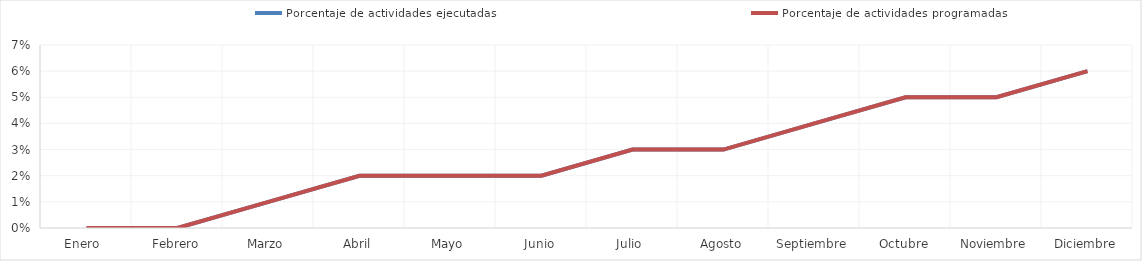
| Category | Porcentaje de actividades ejecutadas  | Porcentaje de actividades programadas |
|---|---|---|
| Enero  | 0 | 0 |
| Febrero | 0 | 0 |
| Marzo | 0.01 | 0.01 |
| Abril | 0.02 | 0.02 |
| Mayo | 0.02 | 0.02 |
| Junio | 0.02 | 0.02 |
| Julio | 0.03 | 0.03 |
| Agosto | 0.03 | 0.03 |
| Septiembre | 0.04 | 0.04 |
| Octubre | 0.05 | 0.05 |
| Noviembre | 0.05 | 0.05 |
| Diciembre | 0.06 | 0.06 |